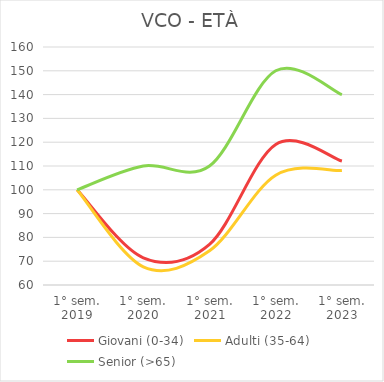
| Category | Giovani (0-34) | Adulti (35-64) | Senior (>65) |
|---|---|---|---|
| 1° sem.
2019 | 100 | 100 | 100 |
| 1° sem.
2020 | 71.429 | 67.653 | 110 |
| 1° sem.
2021 | 77.041 | 74.359 | 110 |
| 1° sem.
2022 | 119.048 | 106.114 | 150 |
| 1° sem.
2023 | 112.075 | 108.087 | 140 |